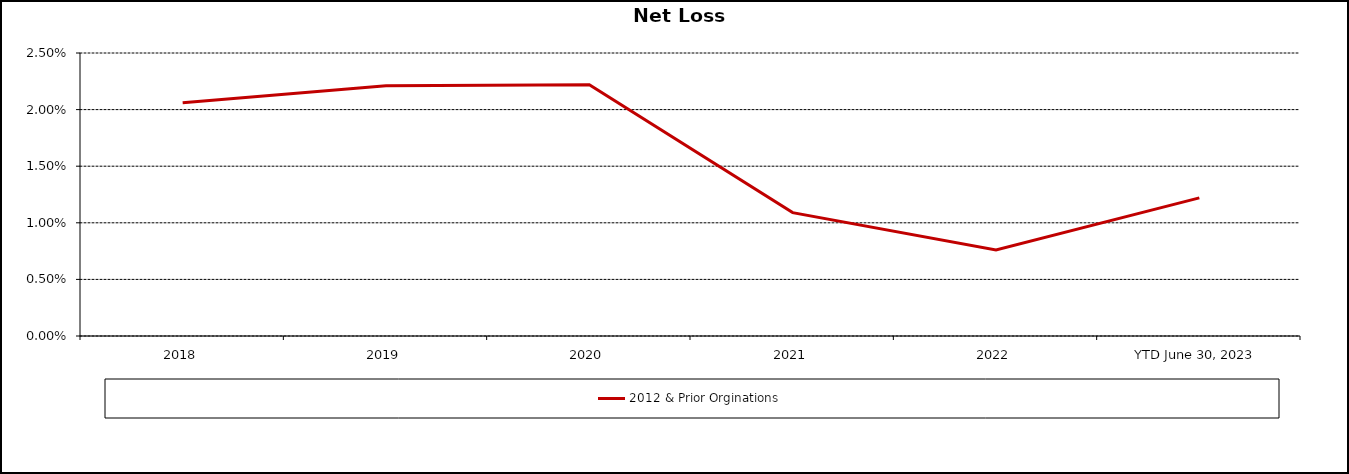
| Category | 2012 & Prior Orginations |
|---|---|
| 2018 | 0.021 |
| 2019 | 0.022 |
| 2020 | 0.022 |
| 2021 | 0.011 |
| 2022 | 0.008 |
| YTD June 30, 2023 | 0.012 |